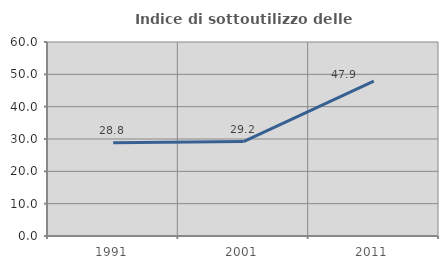
| Category | Indice di sottoutilizzo delle abitazioni  |
|---|---|
| 1991.0 | 28.834 |
| 2001.0 | 29.213 |
| 2011.0 | 47.929 |